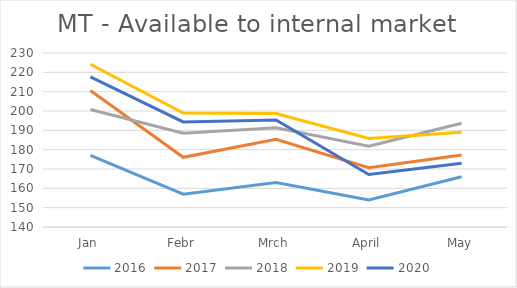
| Category | 2016 | 2017 | 2018 | 2019 | 2020 |
|---|---|---|---|---|---|
| Jan | 177 | 210.608 | 200.782 | 224.173 | 217.644 |
| Febr | 157 | 176.034 | 188.557 | 198.905 | 194.373 |
| Mrch | 163 | 185.369 | 191.325 | 198.658 | 195.313 |
| April | 154 | 170.669 | 181.752 | 185.742 | 167.121 |
| May | 166 | 177.217 | 193.642 | 189.026 | 172.936 |